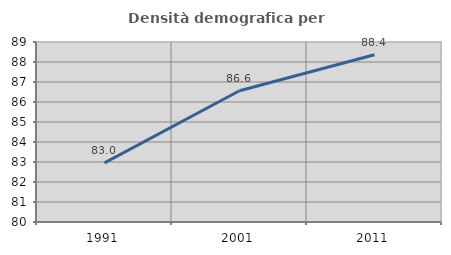
| Category | Densità demografica |
|---|---|
| 1991.0 | 82.954 |
| 2001.0 | 86.561 |
| 2011.0 | 88.364 |